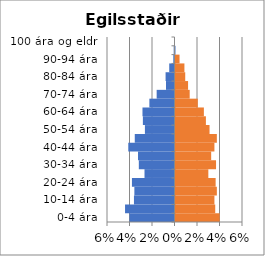
| Category | % karlar | %konur |
|---|---|---|
| 0-4 ára | -0.04 | 0.039 |
| 5-9 ára | -0.044 | 0.035 |
| 10-14 ára | -0.036 | 0.035 |
| 15-19 ára | -0.036 | 0.037 |
| 20-24 ára | -0.038 | 0.036 |
| 25-29 ára | -0.027 | 0.029 |
| 30-34 ára | -0.032 | 0.036 |
| 35-39 ára | -0.032 | 0.032 |
| 40-44 ára | -0.041 | 0.035 |
| 45-49 ára | -0.035 | 0.037 |
| 50-54 ára | -0.026 | 0.03 |
| 55-59 ára | -0.028 | 0.027 |
| 60-64 ára | -0.028 | 0.025 |
| 65-69 ára | -0.022 | 0.02 |
| 70-74 ára | -0.016 | 0.013 |
| 75-79 ára | -0.008 | 0.011 |
| 80-84 ára | -0.008 | 0.009 |
| 85-89 ára | -0.005 | 0.008 |
| 90-94 ára | -0.001 | 0.004 |
| 95-99 ára | -0.001 | 0 |
| 100 ára og eldri | 0 | 0 |